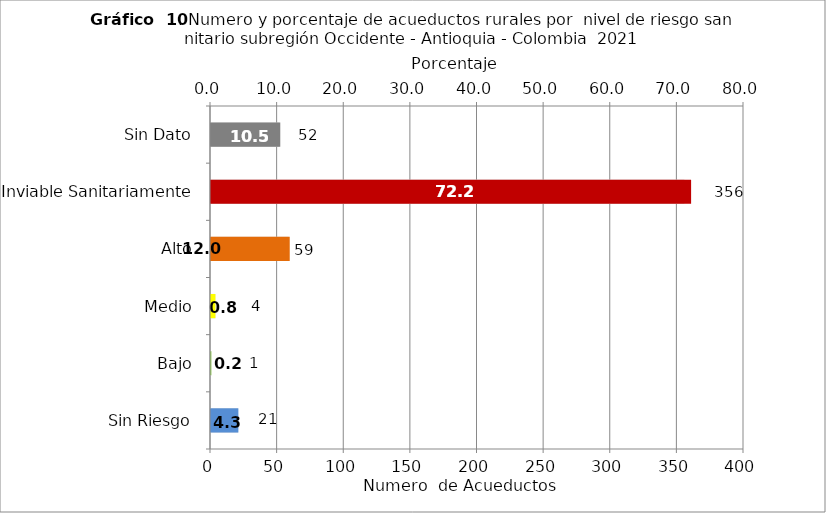
| Category | Número de Sistemas |
|---|---|
| Sin Riesgo | 21 |
| Bajo | 1 |
| Medio | 4 |
| Alto | 59 |
| Inviable Sanitariamente | 356 |
| Sin Dato | 52 |